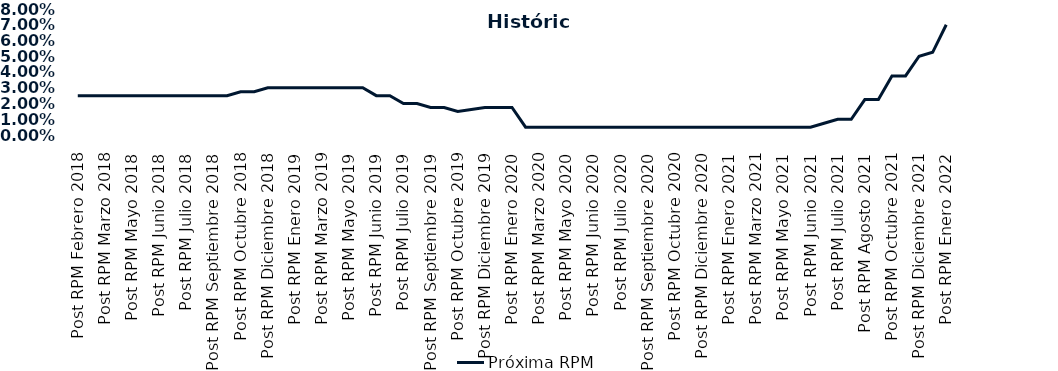
| Category | Próxima RPM |
|---|---|
| Post RPM Febrero 2018 | 0.025 |
| Pre RPM Marzo 2018 | 0.025 |
| Post RPM Marzo 2018 | 0.025 |
| Pre RPM Mayo 2018 | 0.025 |
| Post RPM Mayo 2018 | 0.025 |
| Pre RPM Junio 2018 | 0.025 |
| Post RPM Junio 2018 | 0.025 |
| Pre RPM Julio 2018 | 0.025 |
| Post RPM Julio 2018 | 0.025 |
| Pre RPM Septiembre 2018 | 0.025 |
| Post RPM Septiembre 2018 | 0.025 |
| Pre RPM Octubre 2018 | 0.025 |
| Post RPM Octubre 2018 | 0.028 |
| Pre RPM Diciembre 2018 | 0.028 |
| Post RPM Diciembre 2018 | 0.03 |
| Pre RPM Enero 2019 | 0.03 |
| Post RPM Enero 2019 | 0.03 |
| Pre RPM Marzo 2019 | 0.03 |
| Post RPM Marzo 2019 | 0.03 |
| Pre RPM Mayo 2019 | 0.03 |
| Post RPM Mayo 2019 | 0.03 |
| Pre RPM Junio 2019 | 0.03 |
| Post RPM Junio 2019 | 0.025 |
| Pre RPM Julio 2019 | 0.025 |
| Post RPM Julio 2019 | 0.02 |
| Pre RPM Septiembre 2019 | 0.02 |
| Post RPM Septiembre 2019 | 0.018 |
| Pre RPM Octubre 2019 | 0.018 |
| Post RPM Octubre 2019 | 0.015 |
| Pre RPM Diciembre 2019 | 0.016 |
| Post RPM Diciembre 2019 | 0.018 |
| Pre RPM Enero 2020 | 0.018 |
| Post RPM Enero 2020 | 0.018 |
| Pre RPM Marzo 2020 | 0.005 |
| Post RPM Marzo 2020 | 0.005 |
| Pre RPM Mayo 2020 | 0.005 |
| Post RPM Mayo 2020 | 0.005 |
| Pre RPM Junio 2020 | 0.005 |
| Post RPM Junio 2020 | 0.005 |
| Pre RPM Julio 2020 | 0.005 |
| Post RPM Julio 2020 | 0.005 |
| Pre RPM Septiembre 2020 | 0.005 |
| Post RPM Septiembre 2020 | 0.005 |
| Pre RPM Octubre 2020 | 0.005 |
| Post RPM Octubre 2020 | 0.005 |
| Pre RPM Diciembre 2020 | 0.005 |
| Post RPM Diciembre 2020 | 0.005 |
| Pre RPM Enero 2021 | 0.005 |
| Post RPM Enero 2021 | 0.005 |
| Pre RPM Marzo 2021 | 0.005 |
| Post RPM Marzo 2021 | 0.005 |
| Pre RPM Mayo 2021 | 0.005 |
| Post RPM Mayo 2021 | 0.005 |
| Pre RPM Junio 2021 | 0.005 |
| Post RPM Junio 2021 | 0.005 |
| Pre RPM Julio 2021 | 0.008 |
| Post RPM Julio 2021 | 0.01 |
| Pre RPM Agosto 2021 | 0.01 |
| Post RPM Agosto 2021 | 0.022 |
| Pre RPM Octubre 2021 | 0.022 |
| Post RPM Octubre 2021 | 0.038 |
| Pre RPM Diciembre 2021 | 0.038 |
| Post RPM Diciembre 2021 | 0.05 |
| Pre RPM Enero 2022 | 0.052 |
| Post RPM Enero 2022 | 0.07 |